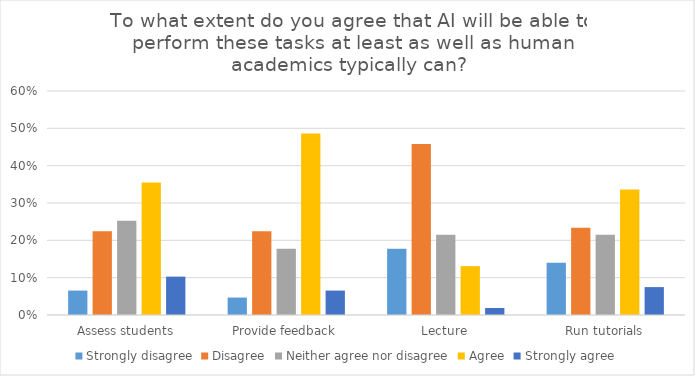
| Category | Strongly disagree | Disagree | Neither agree nor disagree | Agree | Strongly agree |
|---|---|---|---|---|---|
| Assess students | 0.065 | 0.224 | 0.252 | 0.355 | 0.103 |
| Provide feedback | 0.047 | 0.224 | 0.178 | 0.486 | 0.065 |
| Lecture | 0.178 | 0.458 | 0.215 | 0.131 | 0.019 |
| Run tutorials | 0.14 | 0.234 | 0.215 | 0.336 | 0.075 |